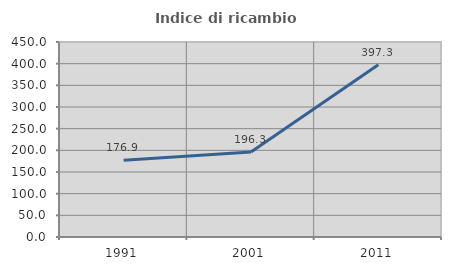
| Category | Indice di ricambio occupazionale  |
|---|---|
| 1991.0 | 176.923 |
| 2001.0 | 196.296 |
| 2011.0 | 397.333 |